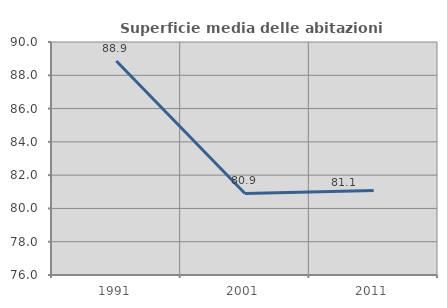
| Category | Superficie media delle abitazioni occupate |
|---|---|
| 1991.0 | 88.857 |
| 2001.0 | 80.9 |
| 2011.0 | 81.08 |